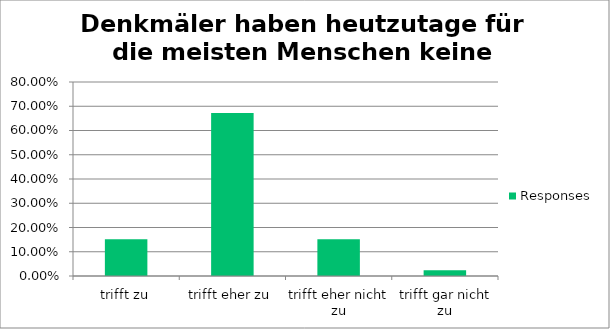
| Category | Responses |
|---|---|
| trifft zu | 0.152 |
| trifft eher zu | 0.672 |
| trifft eher nicht zu | 0.152 |
| trifft gar nicht zu | 0.024 |